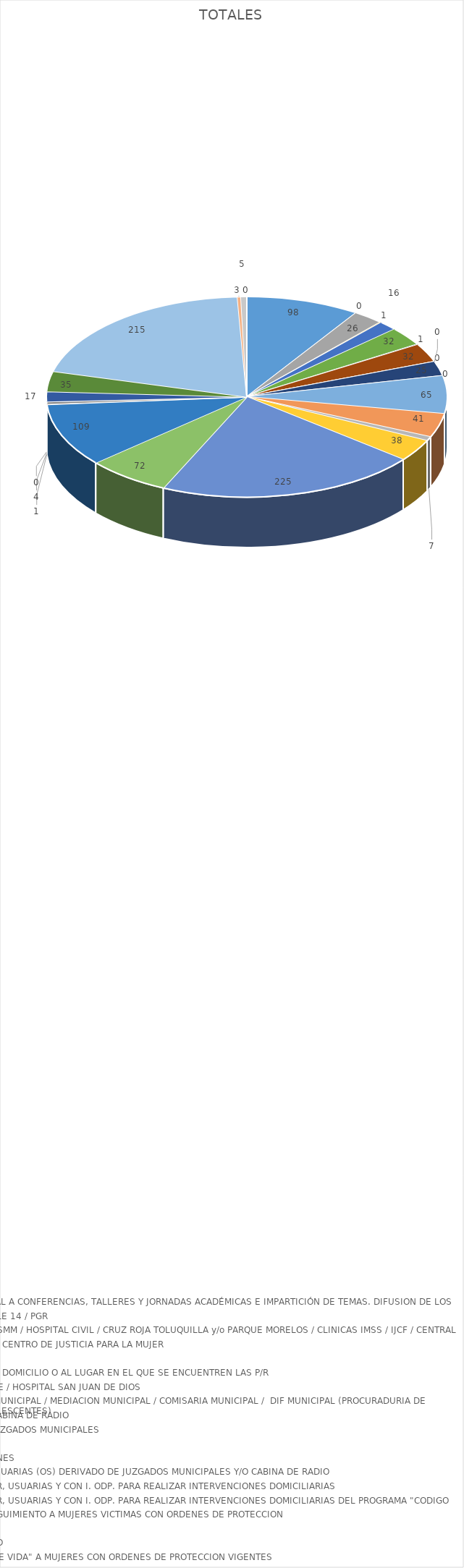
| Category | TOTALES |
|---|---|
| ASESORIAS JURÍDICAS | 98 |
| ORIENTACION JURIDICA | 0 |
| ACUDIR O ASISTIR DE FORMA VIRTUAL A CONFERENCIAS, TALLERES Y JORNADAS ACADÉMICAS E IMPARTICIÓN DE TEMAS. DIFUSION DE LOS SERVICIOS EN LAS COLONIAS | 26 |
| ACOMPAÑAMIENTOS A FISCALÍA CALLE 14 / PGR | 1 |
| ACOMPAÑAMIENTO Y/O SE ACUDE A SMM / HOSPITAL CIVIL / CRUZ ROJA TOLUQUILLA y/o PARQUE MORELOS / CLINICAS IMSS / IJCF / CENTRAL CAMIONERA | 16 |
| ACOMPAÑAMIENTO Y/O SE ACUDE AL CENTRO DE JUSTICIA PARA LA MUJER | 32 |
| ACOMPAÑAMIENTO A CIUDAD NIÑEZ  | 1 |
| ACOMPAÑAMIENTO Y/O SE ACUDE AL DOMICILIO O AL LUGAR EN EL QUE SE ENCUENTREN LAS P/R | 32 |
| ACOMPAÑAMIENTO A SALME / CISAME / HOSPITAL SAN JUAN DE DIOS | 0 |
| ACOMPAÑAMIENTO A PRESIDENCIA MUNICIPAL / MEDIACION MUNICIPAL / COMISARIA MUNICIPAL /  DIF MUNICIPAL (PROCURADURIA DE PROTECCION A NIÑOS, NIÑAS Y ADOLESCENTES) | 0 |
| SERVICIOS DERIVADOS MEDIANTE CABINA DE RADIO | 25 |
| SERVICIOS DERIVADOS MEDIANTE JUZGADOS MUNICIPALES | 0 |
| CANALIZACIÓN INTERNA | 65 |
| CANALIZACIÓN A OTRAS INSTITUCIONES | 41 |
| COMUNICACIÓN TELEFONICA CON USUARIAS (OS) DERIVADO DE JUZGADOS MUNICIPALES Y/O CABINA DE RADIO | 7 |
| COMUNICACIÓN TELEFONICA CON P/R, USUARIAS Y CON I. ODP. PARA REALIZAR INTERVENCIONES DOMICILIARIAS   | 38 |
| COMUNICACIÓN TELEFONICA CON P/R, USUARIAS Y CON I. ODP. PARA REALIZAR INTERVENCIONES DOMICILIARIAS DEL PROGRAMA "CODIGO VIOLETA"  | 225 |
| INTERVENCIÓN DOMICILIARIA DE SEGUIMIENTO A MUJERES VICTIMAS CON ORDENES DE PROTECCION  | 72 |
| VISITAS DOMICILIARIAS  | 109 |
| ATENCIONES Y AUXILIO PSICOLÓGICO | 1 |
| ENTREGA DE DISPOSITIVO "PULSO DE VIDA" A MUJERES CON ORDENES DE PROTECCION VIGENTES | 4 |
| CAMBIO DE DISPOSITIVO "PULSO DE VIDA" A MUJERES CON ORDENES DE PROTECCION VIGENTES | 0 |
| PRORROGA DE DISPOSITIVO "PULSO DE VIDA" A MUJERES CON CARPETA DE INVESTIGACION EN CURSO | 17 |
| RECOLECCION DE DISPOSITIVO "PULSO DE VIDA" A MUJERES CON ORDENES DE PROTECCION VENCIDAS | 35 |
| ENTREVISTAS A MUJERES VICTIMAS DE VIOLENCIA CON ORDENES DE PROTECCION VIGENTES DEL PROGRAMA "CODIGO VIOLETA" | 215 |
| SERVICIOS DERIVADOS POR EL AREA DE CANNAT | 3 |
| SOLICITUD DEL AREA DE T. SOCIAL DEL CENTRO DE JUSTICIA PARA LAS MUJERES PARA REALIZAR EL TRASLADO DE LAS USUARIAS A SU DOMICILIO. | 5 |
| ATENCION CIUDADANA / DERIVACIONES VARIAS | 0 |